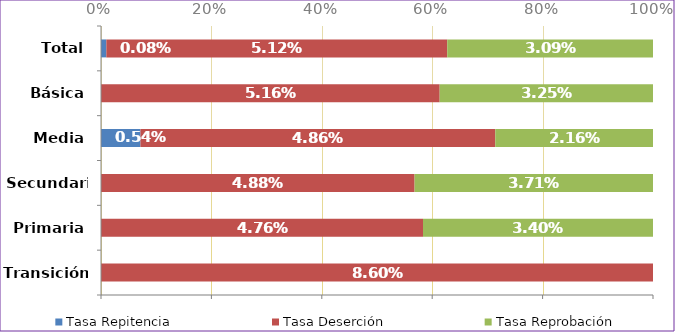
| Category | Tasa Repitencia | Tasa Deserción | Tasa Reprobación |
|---|---|---|---|
| Transición | 0 | 0.086 | 0 |
| Primaria | 0 | 0.048 | 0.034 |
| Secundaria | 0 | 0.049 | 0.037 |
| Media | 0.005 | 0.049 | 0.022 |
| Básica | 0 | 0.052 | 0.032 |
| Total | 0.001 | 0.051 | 0.031 |